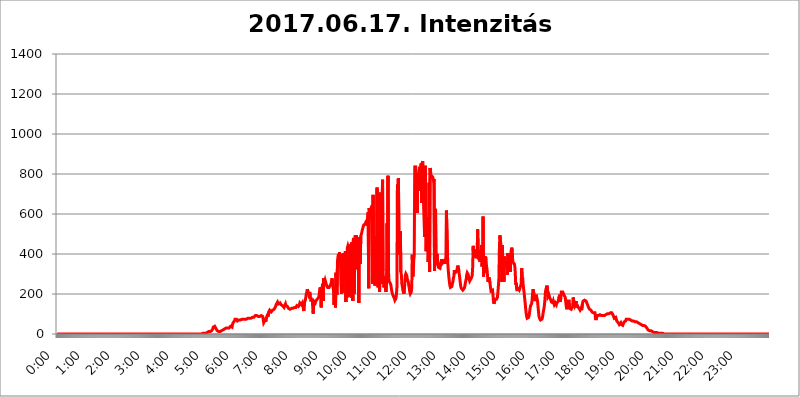
| Category | 2017.06.17. Intenzitás [W/m^2] |
|---|---|
| 0.0 | 0 |
| 0.0006944444444444445 | 0 |
| 0.001388888888888889 | 0 |
| 0.0020833333333333333 | 0 |
| 0.002777777777777778 | 0 |
| 0.003472222222222222 | 0 |
| 0.004166666666666667 | 0 |
| 0.004861111111111111 | 0 |
| 0.005555555555555556 | 0 |
| 0.0062499999999999995 | 0 |
| 0.006944444444444444 | 0 |
| 0.007638888888888889 | 0 |
| 0.008333333333333333 | 0 |
| 0.009027777777777779 | 0 |
| 0.009722222222222222 | 0 |
| 0.010416666666666666 | 0 |
| 0.011111111111111112 | 0 |
| 0.011805555555555555 | 0 |
| 0.012499999999999999 | 0 |
| 0.013194444444444444 | 0 |
| 0.013888888888888888 | 0 |
| 0.014583333333333332 | 0 |
| 0.015277777777777777 | 0 |
| 0.015972222222222224 | 0 |
| 0.016666666666666666 | 0 |
| 0.017361111111111112 | 0 |
| 0.018055555555555557 | 0 |
| 0.01875 | 0 |
| 0.019444444444444445 | 0 |
| 0.02013888888888889 | 0 |
| 0.020833333333333332 | 0 |
| 0.02152777777777778 | 0 |
| 0.022222222222222223 | 0 |
| 0.02291666666666667 | 0 |
| 0.02361111111111111 | 0 |
| 0.024305555555555556 | 0 |
| 0.024999999999999998 | 0 |
| 0.025694444444444447 | 0 |
| 0.02638888888888889 | 0 |
| 0.027083333333333334 | 0 |
| 0.027777777777777776 | 0 |
| 0.02847222222222222 | 0 |
| 0.029166666666666664 | 0 |
| 0.029861111111111113 | 0 |
| 0.030555555555555555 | 0 |
| 0.03125 | 0 |
| 0.03194444444444445 | 0 |
| 0.03263888888888889 | 0 |
| 0.03333333333333333 | 0 |
| 0.034027777777777775 | 0 |
| 0.034722222222222224 | 0 |
| 0.035416666666666666 | 0 |
| 0.036111111111111115 | 0 |
| 0.03680555555555556 | 0 |
| 0.0375 | 0 |
| 0.03819444444444444 | 0 |
| 0.03888888888888889 | 0 |
| 0.03958333333333333 | 0 |
| 0.04027777777777778 | 0 |
| 0.04097222222222222 | 0 |
| 0.041666666666666664 | 0 |
| 0.042361111111111106 | 0 |
| 0.04305555555555556 | 0 |
| 0.043750000000000004 | 0 |
| 0.044444444444444446 | 0 |
| 0.04513888888888889 | 0 |
| 0.04583333333333334 | 0 |
| 0.04652777777777778 | 0 |
| 0.04722222222222222 | 0 |
| 0.04791666666666666 | 0 |
| 0.04861111111111111 | 0 |
| 0.049305555555555554 | 0 |
| 0.049999999999999996 | 0 |
| 0.05069444444444445 | 0 |
| 0.051388888888888894 | 0 |
| 0.052083333333333336 | 0 |
| 0.05277777777777778 | 0 |
| 0.05347222222222222 | 0 |
| 0.05416666666666667 | 0 |
| 0.05486111111111111 | 0 |
| 0.05555555555555555 | 0 |
| 0.05625 | 0 |
| 0.05694444444444444 | 0 |
| 0.057638888888888885 | 0 |
| 0.05833333333333333 | 0 |
| 0.05902777777777778 | 0 |
| 0.059722222222222225 | 0 |
| 0.06041666666666667 | 0 |
| 0.061111111111111116 | 0 |
| 0.06180555555555556 | 0 |
| 0.0625 | 0 |
| 0.06319444444444444 | 0 |
| 0.06388888888888888 | 0 |
| 0.06458333333333334 | 0 |
| 0.06527777777777778 | 0 |
| 0.06597222222222222 | 0 |
| 0.06666666666666667 | 0 |
| 0.06736111111111111 | 0 |
| 0.06805555555555555 | 0 |
| 0.06874999999999999 | 0 |
| 0.06944444444444443 | 0 |
| 0.07013888888888889 | 0 |
| 0.07083333333333333 | 0 |
| 0.07152777777777779 | 0 |
| 0.07222222222222223 | 0 |
| 0.07291666666666667 | 0 |
| 0.07361111111111111 | 0 |
| 0.07430555555555556 | 0 |
| 0.075 | 0 |
| 0.07569444444444444 | 0 |
| 0.0763888888888889 | 0 |
| 0.07708333333333334 | 0 |
| 0.07777777777777778 | 0 |
| 0.07847222222222222 | 0 |
| 0.07916666666666666 | 0 |
| 0.0798611111111111 | 0 |
| 0.08055555555555556 | 0 |
| 0.08125 | 0 |
| 0.08194444444444444 | 0 |
| 0.08263888888888889 | 0 |
| 0.08333333333333333 | 0 |
| 0.08402777777777777 | 0 |
| 0.08472222222222221 | 0 |
| 0.08541666666666665 | 0 |
| 0.08611111111111112 | 0 |
| 0.08680555555555557 | 0 |
| 0.08750000000000001 | 0 |
| 0.08819444444444445 | 0 |
| 0.08888888888888889 | 0 |
| 0.08958333333333333 | 0 |
| 0.09027777777777778 | 0 |
| 0.09097222222222222 | 0 |
| 0.09166666666666667 | 0 |
| 0.09236111111111112 | 0 |
| 0.09305555555555556 | 0 |
| 0.09375 | 0 |
| 0.09444444444444444 | 0 |
| 0.09513888888888888 | 0 |
| 0.09583333333333333 | 0 |
| 0.09652777777777777 | 0 |
| 0.09722222222222222 | 0 |
| 0.09791666666666667 | 0 |
| 0.09861111111111111 | 0 |
| 0.09930555555555555 | 0 |
| 0.09999999999999999 | 0 |
| 0.10069444444444443 | 0 |
| 0.1013888888888889 | 0 |
| 0.10208333333333335 | 0 |
| 0.10277777777777779 | 0 |
| 0.10347222222222223 | 0 |
| 0.10416666666666667 | 0 |
| 0.10486111111111111 | 0 |
| 0.10555555555555556 | 0 |
| 0.10625 | 0 |
| 0.10694444444444444 | 0 |
| 0.1076388888888889 | 0 |
| 0.10833333333333334 | 0 |
| 0.10902777777777778 | 0 |
| 0.10972222222222222 | 0 |
| 0.1111111111111111 | 0 |
| 0.11180555555555556 | 0 |
| 0.11180555555555556 | 0 |
| 0.1125 | 0 |
| 0.11319444444444444 | 0 |
| 0.11388888888888889 | 0 |
| 0.11458333333333333 | 0 |
| 0.11527777777777777 | 0 |
| 0.11597222222222221 | 0 |
| 0.11666666666666665 | 0 |
| 0.1173611111111111 | 0 |
| 0.11805555555555557 | 0 |
| 0.11944444444444445 | 0 |
| 0.12013888888888889 | 0 |
| 0.12083333333333333 | 0 |
| 0.12152777777777778 | 0 |
| 0.12222222222222223 | 0 |
| 0.12291666666666667 | 0 |
| 0.12291666666666667 | 0 |
| 0.12361111111111112 | 0 |
| 0.12430555555555556 | 0 |
| 0.125 | 0 |
| 0.12569444444444444 | 0 |
| 0.12638888888888888 | 0 |
| 0.12708333333333333 | 0 |
| 0.16875 | 0 |
| 0.12847222222222224 | 0 |
| 0.12916666666666668 | 0 |
| 0.12986111111111112 | 0 |
| 0.13055555555555556 | 0 |
| 0.13125 | 0 |
| 0.13194444444444445 | 0 |
| 0.1326388888888889 | 0 |
| 0.13333333333333333 | 0 |
| 0.13402777777777777 | 0 |
| 0.13402777777777777 | 0 |
| 0.13472222222222222 | 0 |
| 0.13541666666666666 | 0 |
| 0.1361111111111111 | 0 |
| 0.13749999999999998 | 0 |
| 0.13819444444444443 | 0 |
| 0.1388888888888889 | 0 |
| 0.13958333333333334 | 0 |
| 0.14027777777777778 | 0 |
| 0.14097222222222222 | 0 |
| 0.14166666666666666 | 0 |
| 0.1423611111111111 | 0 |
| 0.14305555555555557 | 0 |
| 0.14375000000000002 | 0 |
| 0.14444444444444446 | 0 |
| 0.1451388888888889 | 0 |
| 0.1451388888888889 | 0 |
| 0.14652777777777778 | 0 |
| 0.14722222222222223 | 0 |
| 0.14791666666666667 | 0 |
| 0.1486111111111111 | 0 |
| 0.14930555555555555 | 0 |
| 0.15 | 0 |
| 0.15069444444444444 | 0 |
| 0.15138888888888888 | 0 |
| 0.15208333333333332 | 0 |
| 0.15277777777777776 | 0 |
| 0.15347222222222223 | 0 |
| 0.15416666666666667 | 0 |
| 0.15486111111111112 | 0 |
| 0.15555555555555556 | 0 |
| 0.15625 | 0 |
| 0.15694444444444444 | 0 |
| 0.15763888888888888 | 0 |
| 0.15833333333333333 | 0 |
| 0.15902777777777777 | 0 |
| 0.15972222222222224 | 0 |
| 0.16041666666666668 | 0 |
| 0.16111111111111112 | 0 |
| 0.16180555555555556 | 0 |
| 0.1625 | 0 |
| 0.16319444444444445 | 0 |
| 0.1638888888888889 | 0 |
| 0.16458333333333333 | 0 |
| 0.16527777777777777 | 0 |
| 0.16597222222222222 | 0 |
| 0.16666666666666666 | 0 |
| 0.1673611111111111 | 0 |
| 0.16805555555555554 | 0 |
| 0.16874999999999998 | 0 |
| 0.16944444444444443 | 0 |
| 0.17013888888888887 | 0 |
| 0.1708333333333333 | 0 |
| 0.17152777777777775 | 0 |
| 0.17222222222222225 | 0 |
| 0.1729166666666667 | 0 |
| 0.17361111111111113 | 0 |
| 0.17430555555555557 | 0 |
| 0.17500000000000002 | 0 |
| 0.17569444444444446 | 0 |
| 0.1763888888888889 | 0 |
| 0.17708333333333334 | 0 |
| 0.17777777777777778 | 0 |
| 0.17847222222222223 | 0 |
| 0.17916666666666667 | 0 |
| 0.1798611111111111 | 0 |
| 0.18055555555555555 | 0 |
| 0.18125 | 0 |
| 0.18194444444444444 | 0 |
| 0.1826388888888889 | 0 |
| 0.18333333333333335 | 0 |
| 0.1840277777777778 | 0 |
| 0.18472222222222223 | 0 |
| 0.18541666666666667 | 0 |
| 0.18611111111111112 | 0 |
| 0.18680555555555556 | 0 |
| 0.1875 | 0 |
| 0.18819444444444444 | 0 |
| 0.18888888888888888 | 0 |
| 0.18958333333333333 | 0 |
| 0.19027777777777777 | 0 |
| 0.1909722222222222 | 0 |
| 0.19166666666666665 | 0 |
| 0.19236111111111112 | 0 |
| 0.19305555555555554 | 0 |
| 0.19375 | 0 |
| 0.19444444444444445 | 0 |
| 0.1951388888888889 | 0 |
| 0.19583333333333333 | 0 |
| 0.19652777777777777 | 0 |
| 0.19722222222222222 | 0 |
| 0.19791666666666666 | 0 |
| 0.1986111111111111 | 0 |
| 0.19930555555555554 | 0 |
| 0.19999999999999998 | 0 |
| 0.20069444444444443 | 0 |
| 0.20138888888888887 | 0 |
| 0.2020833333333333 | 0 |
| 0.2027777777777778 | 0 |
| 0.2034722222222222 | 3.525 |
| 0.2041666666666667 | 3.525 |
| 0.20486111111111113 | 3.525 |
| 0.20555555555555557 | 3.525 |
| 0.20625000000000002 | 3.525 |
| 0.20694444444444446 | 3.525 |
| 0.2076388888888889 | 3.525 |
| 0.20833333333333334 | 3.525 |
| 0.20902777777777778 | 7.887 |
| 0.20972222222222223 | 7.887 |
| 0.21041666666666667 | 7.887 |
| 0.2111111111111111 | 7.887 |
| 0.21180555555555555 | 12.257 |
| 0.2125 | 12.257 |
| 0.21319444444444444 | 12.257 |
| 0.2138888888888889 | 12.257 |
| 0.21458333333333335 | 12.257 |
| 0.2152777777777778 | 12.257 |
| 0.21597222222222223 | 16.636 |
| 0.21666666666666667 | 16.636 |
| 0.21736111111111112 | 21.024 |
| 0.21805555555555556 | 25.419 |
| 0.21875 | 34.234 |
| 0.21944444444444444 | 34.234 |
| 0.22013888888888888 | 38.653 |
| 0.22083333333333333 | 38.653 |
| 0.22152777777777777 | 38.653 |
| 0.2222222222222222 | 34.234 |
| 0.22291666666666665 | 25.419 |
| 0.2236111111111111 | 21.024 |
| 0.22430555555555556 | 16.636 |
| 0.225 | 12.257 |
| 0.22569444444444445 | 12.257 |
| 0.2263888888888889 | 12.257 |
| 0.22708333333333333 | 12.257 |
| 0.22777777777777777 | 12.257 |
| 0.22847222222222222 | 12.257 |
| 0.22916666666666666 | 12.257 |
| 0.2298611111111111 | 16.636 |
| 0.23055555555555554 | 16.636 |
| 0.23124999999999998 | 21.024 |
| 0.23194444444444443 | 21.024 |
| 0.23263888888888887 | 21.024 |
| 0.2333333333333333 | 25.419 |
| 0.2340277777777778 | 25.419 |
| 0.2347222222222222 | 25.419 |
| 0.2354166666666667 | 25.419 |
| 0.23611111111111113 | 25.419 |
| 0.23680555555555557 | 29.823 |
| 0.23750000000000002 | 29.823 |
| 0.23819444444444446 | 29.823 |
| 0.2388888888888889 | 29.823 |
| 0.23958333333333334 | 29.823 |
| 0.24027777777777778 | 29.823 |
| 0.24097222222222223 | 29.823 |
| 0.24166666666666667 | 29.823 |
| 0.2423611111111111 | 29.823 |
| 0.24305555555555555 | 38.653 |
| 0.24375 | 34.234 |
| 0.24444444444444446 | 34.234 |
| 0.24513888888888888 | 34.234 |
| 0.24583333333333335 | 47.511 |
| 0.2465277777777778 | 56.398 |
| 0.24722222222222223 | 51.951 |
| 0.24791666666666667 | 60.85 |
| 0.24861111111111112 | 65.31 |
| 0.24930555555555556 | 74.246 |
| 0.25 | 74.246 |
| 0.25069444444444444 | 74.246 |
| 0.2513888888888889 | 74.246 |
| 0.2520833333333333 | 69.775 |
| 0.25277777777777777 | 65.31 |
| 0.2534722222222222 | 69.775 |
| 0.25416666666666665 | 69.775 |
| 0.2548611111111111 | 69.775 |
| 0.2555555555555556 | 69.775 |
| 0.25625000000000003 | 69.775 |
| 0.2569444444444445 | 69.775 |
| 0.2576388888888889 | 69.775 |
| 0.25833333333333336 | 74.246 |
| 0.2590277777777778 | 74.246 |
| 0.25972222222222224 | 74.246 |
| 0.2604166666666667 | 74.246 |
| 0.2611111111111111 | 74.246 |
| 0.26180555555555557 | 74.246 |
| 0.2625 | 74.246 |
| 0.26319444444444445 | 74.246 |
| 0.2638888888888889 | 74.246 |
| 0.26458333333333334 | 74.246 |
| 0.2652777777777778 | 74.246 |
| 0.2659722222222222 | 74.246 |
| 0.26666666666666666 | 78.722 |
| 0.2673611111111111 | 78.722 |
| 0.26805555555555555 | 78.722 |
| 0.26875 | 78.722 |
| 0.26944444444444443 | 78.722 |
| 0.2701388888888889 | 78.722 |
| 0.2708333333333333 | 78.722 |
| 0.27152777777777776 | 78.722 |
| 0.2722222222222222 | 83.205 |
| 0.27291666666666664 | 83.205 |
| 0.2736111111111111 | 83.205 |
| 0.2743055555555555 | 87.692 |
| 0.27499999999999997 | 83.205 |
| 0.27569444444444446 | 83.205 |
| 0.27638888888888885 | 87.692 |
| 0.27708333333333335 | 87.692 |
| 0.2777777777777778 | 92.184 |
| 0.27847222222222223 | 92.184 |
| 0.2791666666666667 | 92.184 |
| 0.2798611111111111 | 92.184 |
| 0.28055555555555556 | 92.184 |
| 0.28125 | 92.184 |
| 0.28194444444444444 | 87.692 |
| 0.2826388888888889 | 87.692 |
| 0.2833333333333333 | 87.692 |
| 0.28402777777777777 | 87.692 |
| 0.2847222222222222 | 92.184 |
| 0.28541666666666665 | 92.184 |
| 0.28611111111111115 | 92.184 |
| 0.28680555555555554 | 92.184 |
| 0.28750000000000003 | 92.184 |
| 0.2881944444444445 | 87.692 |
| 0.2888888888888889 | 83.205 |
| 0.28958333333333336 | 56.398 |
| 0.2902777777777778 | 56.398 |
| 0.29097222222222224 | 51.951 |
| 0.2916666666666667 | 69.775 |
| 0.2923611111111111 | 60.85 |
| 0.29305555555555557 | 74.246 |
| 0.29375 | 69.775 |
| 0.29444444444444445 | 69.775 |
| 0.2951388888888889 | 101.184 |
| 0.29583333333333334 | 87.692 |
| 0.2965277777777778 | 110.201 |
| 0.2972222222222222 | 114.716 |
| 0.29791666666666666 | 119.235 |
| 0.2986111111111111 | 119.235 |
| 0.29930555555555555 | 114.716 |
| 0.3 | 110.201 |
| 0.30069444444444443 | 110.201 |
| 0.3013888888888889 | 114.716 |
| 0.3020833333333333 | 119.235 |
| 0.30277777777777776 | 123.758 |
| 0.3034722222222222 | 123.758 |
| 0.30416666666666664 | 123.758 |
| 0.3048611111111111 | 128.284 |
| 0.3055555555555555 | 128.284 |
| 0.30624999999999997 | 137.347 |
| 0.3069444444444444 | 146.423 |
| 0.3076388888888889 | 150.964 |
| 0.30833333333333335 | 141.884 |
| 0.3090277777777778 | 160.056 |
| 0.30972222222222223 | 155.509 |
| 0.3104166666666667 | 150.964 |
| 0.3111111111111111 | 150.964 |
| 0.31180555555555556 | 150.964 |
| 0.3125 | 155.509 |
| 0.31319444444444444 | 150.964 |
| 0.3138888888888889 | 146.423 |
| 0.3145833333333333 | 146.423 |
| 0.31527777777777777 | 146.423 |
| 0.3159722222222222 | 141.884 |
| 0.31666666666666665 | 137.347 |
| 0.31736111111111115 | 137.347 |
| 0.31805555555555554 | 132.814 |
| 0.31875000000000003 | 137.347 |
| 0.3194444444444445 | 132.814 |
| 0.3201388888888889 | 150.964 |
| 0.32083333333333336 | 141.884 |
| 0.3215277777777778 | 146.423 |
| 0.32222222222222224 | 141.884 |
| 0.3229166666666667 | 137.347 |
| 0.3236111111111111 | 132.814 |
| 0.32430555555555557 | 128.284 |
| 0.325 | 128.284 |
| 0.32569444444444445 | 128.284 |
| 0.3263888888888889 | 123.758 |
| 0.32708333333333334 | 128.284 |
| 0.3277777777777778 | 123.758 |
| 0.3284722222222222 | 128.284 |
| 0.32916666666666666 | 123.758 |
| 0.3298611111111111 | 128.284 |
| 0.33055555555555555 | 128.284 |
| 0.33125 | 128.284 |
| 0.33194444444444443 | 128.284 |
| 0.3326388888888889 | 132.814 |
| 0.3333333333333333 | 132.814 |
| 0.3340277777777778 | 132.814 |
| 0.3347222222222222 | 132.814 |
| 0.3354166666666667 | 132.814 |
| 0.3361111111111111 | 141.884 |
| 0.3368055555555556 | 137.347 |
| 0.33749999999999997 | 137.347 |
| 0.33819444444444446 | 137.347 |
| 0.33888888888888885 | 137.347 |
| 0.33958333333333335 | 146.423 |
| 0.34027777777777773 | 155.509 |
| 0.34097222222222223 | 150.964 |
| 0.3416666666666666 | 150.964 |
| 0.3423611111111111 | 146.423 |
| 0.3430555555555555 | 150.964 |
| 0.34375 | 155.509 |
| 0.3444444444444445 | 155.509 |
| 0.3451388888888889 | 155.509 |
| 0.3458333333333334 | 114.716 |
| 0.34652777777777777 | 155.509 |
| 0.34722222222222227 | 160.056 |
| 0.34791666666666665 | 169.156 |
| 0.34861111111111115 | 182.82 |
| 0.34930555555555554 | 201.058 |
| 0.35000000000000003 | 210.182 |
| 0.3506944444444444 | 223.873 |
| 0.3513888888888889 | 228.436 |
| 0.3520833333333333 | 205.62 |
| 0.3527777777777778 | 196.497 |
| 0.3534722222222222 | 201.058 |
| 0.3541666666666667 | 210.182 |
| 0.3548611111111111 | 191.937 |
| 0.35555555555555557 | 169.156 |
| 0.35625 | 164.605 |
| 0.35694444444444445 | 173.709 |
| 0.3576388888888889 | 169.156 |
| 0.35833333333333334 | 164.605 |
| 0.3590277777777778 | 101.184 |
| 0.3597222222222222 | 164.605 |
| 0.36041666666666666 | 164.605 |
| 0.3611111111111111 | 164.605 |
| 0.36180555555555555 | 155.509 |
| 0.3625 | 164.605 |
| 0.36319444444444443 | 169.156 |
| 0.3638888888888889 | 169.156 |
| 0.3645833333333333 | 173.709 |
| 0.3652777777777778 | 173.709 |
| 0.3659722222222222 | 178.264 |
| 0.3666666666666667 | 182.82 |
| 0.3673611111111111 | 196.497 |
| 0.3680555555555556 | 219.309 |
| 0.36874999999999997 | 233 |
| 0.36944444444444446 | 219.309 |
| 0.37013888888888885 | 132.814 |
| 0.37083333333333335 | 219.309 |
| 0.37152777777777773 | 223.873 |
| 0.37222222222222223 | 251.251 |
| 0.3729166666666666 | 164.605 |
| 0.3736111111111111 | 278.603 |
| 0.3743055555555555 | 269.49 |
| 0.375 | 260.373 |
| 0.3756944444444445 | 269.49 |
| 0.3763888888888889 | 260.373 |
| 0.3770833333333334 | 251.251 |
| 0.37777777777777777 | 242.127 |
| 0.37847222222222227 | 237.564 |
| 0.37916666666666665 | 233 |
| 0.37986111111111115 | 228.436 |
| 0.38055555555555554 | 233 |
| 0.38125000000000003 | 233 |
| 0.3819444444444444 | 237.564 |
| 0.3826388888888889 | 242.127 |
| 0.3833333333333333 | 246.689 |
| 0.3840277777777778 | 251.251 |
| 0.3847222222222222 | 264.932 |
| 0.3854166666666667 | 278.603 |
| 0.3861111111111111 | 274.047 |
| 0.38680555555555557 | 274.047 |
| 0.3875 | 219.309 |
| 0.38819444444444445 | 146.423 |
| 0.3888888888888889 | 223.873 |
| 0.38958333333333334 | 182.82 |
| 0.3902777777777778 | 132.814 |
| 0.3909722222222222 | 305.898 |
| 0.39166666666666666 | 233 |
| 0.3923611111111111 | 196.497 |
| 0.39305555555555555 | 364.728 |
| 0.39375 | 387.202 |
| 0.39444444444444443 | 400.638 |
| 0.3951388888888889 | 351.198 |
| 0.3958333333333333 | 409.574 |
| 0.3965277777777778 | 369.23 |
| 0.3972222222222222 | 400.638 |
| 0.3979166666666667 | 396.164 |
| 0.3986111111111111 | 201.058 |
| 0.3993055555555556 | 233 |
| 0.39999999999999997 | 364.728 |
| 0.40069444444444446 | 205.62 |
| 0.40138888888888885 | 405.108 |
| 0.40208333333333335 | 400.638 |
| 0.40277777777777773 | 378.224 |
| 0.40347222222222223 | 400.638 |
| 0.4041666666666666 | 414.035 |
| 0.4048611111111111 | 160.056 |
| 0.4055555555555555 | 405.108 |
| 0.40625 | 182.82 |
| 0.4069444444444445 | 431.833 |
| 0.4076388888888889 | 440.702 |
| 0.4083333333333334 | 431.833 |
| 0.40902777777777777 | 431.833 |
| 0.40972222222222227 | 431.833 |
| 0.41041666666666665 | 187.378 |
| 0.41111111111111115 | 431.833 |
| 0.41180555555555554 | 449.551 |
| 0.41250000000000003 | 182.82 |
| 0.4131944444444444 | 458.38 |
| 0.4138888888888889 | 458.38 |
| 0.4145833333333333 | 164.605 |
| 0.4152777777777778 | 471.582 |
| 0.4159722222222222 | 480.356 |
| 0.4166666666666667 | 201.058 |
| 0.4173611111111111 | 462.786 |
| 0.41805555555555557 | 493.475 |
| 0.41875 | 324.052 |
| 0.41944444444444445 | 493.475 |
| 0.4201388888888889 | 475.972 |
| 0.42083333333333334 | 462.786 |
| 0.4215277777777778 | 467.187 |
| 0.4222222222222222 | 471.582 |
| 0.42291666666666666 | 155.509 |
| 0.4236111111111111 | 484.735 |
| 0.42430555555555555 | 480.356 |
| 0.425 | 351.198 |
| 0.42569444444444443 | 489.108 |
| 0.4263888888888889 | 493.475 |
| 0.4270833333333333 | 506.542 |
| 0.4277777777777778 | 519.555 |
| 0.4284722222222222 | 528.2 |
| 0.4291666666666667 | 532.513 |
| 0.4298611111111111 | 545.416 |
| 0.4305555555555556 | 549.704 |
| 0.43124999999999997 | 549.704 |
| 0.43194444444444446 | 549.704 |
| 0.43263888888888885 | 558.261 |
| 0.43333333333333335 | 553.986 |
| 0.43402777777777773 | 566.793 |
| 0.43472222222222223 | 541.121 |
| 0.4354166666666666 | 588.009 |
| 0.4361111111111111 | 609.062 |
| 0.4368055555555555 | 228.436 |
| 0.4375 | 629.948 |
| 0.4381944444444445 | 617.436 |
| 0.4388888888888889 | 617.436 |
| 0.4395833333333334 | 625.784 |
| 0.44027777777777777 | 613.252 |
| 0.44097222222222227 | 575.299 |
| 0.44166666666666665 | 642.4 |
| 0.44236111111111115 | 251.251 |
| 0.44305555555555554 | 695.666 |
| 0.44375000000000003 | 264.932 |
| 0.4444444444444444 | 278.603 |
| 0.4451388888888889 | 296.808 |
| 0.4458333333333333 | 242.127 |
| 0.4465277777777778 | 489.108 |
| 0.4472222222222222 | 324.052 |
| 0.4479166666666667 | 274.047 |
| 0.4486111111111111 | 731.896 |
| 0.44930555555555557 | 269.49 |
| 0.45 | 233 |
| 0.45069444444444445 | 333.113 |
| 0.4513888888888889 | 264.932 |
| 0.45208333333333334 | 210.182 |
| 0.4527777777777778 | 369.23 |
| 0.4534722222222222 | 707.8 |
| 0.45416666666666666 | 251.251 |
| 0.4548611111111111 | 251.251 |
| 0.45555555555555555 | 255.813 |
| 0.45625 | 771.559 |
| 0.45694444444444443 | 314.98 |
| 0.4576388888888889 | 260.373 |
| 0.4583333333333333 | 233 |
| 0.4590277777777778 | 287.709 |
| 0.4597222222222222 | 242.127 |
| 0.4604166666666667 | 223.873 |
| 0.4611111111111111 | 210.182 |
| 0.4618055555555556 | 264.932 |
| 0.46249999999999997 | 553.986 |
| 0.46319444444444446 | 337.639 |
| 0.46388888888888885 | 791.169 |
| 0.46458333333333335 | 310.44 |
| 0.46527777777777773 | 264.932 |
| 0.46597222222222223 | 269.49 |
| 0.4666666666666666 | 264.932 |
| 0.4673611111111111 | 251.251 |
| 0.4680555555555555 | 242.127 |
| 0.46875 | 223.873 |
| 0.4694444444444445 | 210.182 |
| 0.4701388888888889 | 201.058 |
| 0.4708333333333334 | 196.497 |
| 0.47152777777777777 | 187.378 |
| 0.47222222222222227 | 182.82 |
| 0.47291666666666665 | 178.264 |
| 0.47361111111111115 | 169.156 |
| 0.47430555555555554 | 164.605 |
| 0.47500000000000003 | 178.264 |
| 0.4756944444444444 | 196.497 |
| 0.4763888888888889 | 233 |
| 0.4770833333333333 | 747.834 |
| 0.4777777777777778 | 675.311 |
| 0.4784722222222222 | 779.42 |
| 0.4791666666666667 | 519.555 |
| 0.4798611111111111 | 396.164 |
| 0.48055555555555557 | 475.972 |
| 0.48125 | 515.223 |
| 0.48194444444444445 | 310.44 |
| 0.4826388888888889 | 296.808 |
| 0.48333333333333334 | 251.251 |
| 0.4840277777777778 | 237.564 |
| 0.4847222222222222 | 219.309 |
| 0.48541666666666666 | 210.182 |
| 0.4861111111111111 | 201.058 |
| 0.48680555555555555 | 214.746 |
| 0.4875 | 255.813 |
| 0.48819444444444443 | 292.259 |
| 0.4888888888888889 | 301.354 |
| 0.4895833333333333 | 296.808 |
| 0.4902777777777778 | 292.259 |
| 0.4909722222222222 | 274.047 |
| 0.4916666666666667 | 278.603 |
| 0.4923611111111111 | 260.373 |
| 0.4930555555555556 | 242.127 |
| 0.49374999999999997 | 228.436 |
| 0.49444444444444446 | 210.182 |
| 0.49513888888888885 | 201.058 |
| 0.49583333333333335 | 196.497 |
| 0.49652777777777773 | 210.182 |
| 0.49722222222222223 | 233 |
| 0.4979166666666666 | 396.164 |
| 0.4986111111111111 | 287.709 |
| 0.4993055555555555 | 296.808 |
| 0.5 | 369.23 |
| 0.5006944444444444 | 391.685 |
| 0.5013888888888889 | 833.834 |
| 0.5020833333333333 | 841.526 |
| 0.5027777777777778 | 822.26 |
| 0.5034722222222222 | 806.757 |
| 0.5041666666666667 | 798.974 |
| 0.5048611111111111 | 604.864 |
| 0.5055555555555555 | 802.868 |
| 0.50625 | 791.169 |
| 0.5069444444444444 | 715.858 |
| 0.5076388888888889 | 818.392 |
| 0.5083333333333333 | 814.519 |
| 0.5090277777777777 | 810.641 |
| 0.5097222222222222 | 806.757 |
| 0.5104166666666666 | 853.029 |
| 0.5111111111111112 | 654.791 |
| 0.5118055555555555 | 853.029 |
| 0.5125000000000001 | 864.493 |
| 0.5131944444444444 | 791.169 |
| 0.513888888888889 | 629.948 |
| 0.5145833333333333 | 634.105 |
| 0.5152777777777778 | 484.735 |
| 0.5159722222222222 | 841.526 |
| 0.5166666666666667 | 617.436 |
| 0.517361111111111 | 414.035 |
| 0.5180555555555556 | 583.779 |
| 0.5187499999999999 | 571.049 |
| 0.5194444444444445 | 453.968 |
| 0.5201388888888888 | 360.221 |
| 0.5208333333333334 | 414.035 |
| 0.5215277777777778 | 755.766 |
| 0.5222222222222223 | 310.44 |
| 0.5229166666666667 | 829.981 |
| 0.5236111111111111 | 814.519 |
| 0.5243055555555556 | 779.42 |
| 0.525 | 795.074 |
| 0.5256944444444445 | 775.492 |
| 0.5263888888888889 | 787.258 |
| 0.5270833333333333 | 775.492 |
| 0.5277777777777778 | 767.62 |
| 0.5284722222222222 | 775.492 |
| 0.5291666666666667 | 314.98 |
| 0.5298611111111111 | 510.885 |
| 0.5305555555555556 | 625.784 |
| 0.53125 | 346.682 |
| 0.5319444444444444 | 342.162 |
| 0.5326388888888889 | 400.638 |
| 0.5333333333333333 | 364.728 |
| 0.5340277777777778 | 342.162 |
| 0.5347222222222222 | 333.113 |
| 0.5354166666666667 | 333.113 |
| 0.5361111111111111 | 328.584 |
| 0.5368055555555555 | 328.584 |
| 0.5375 | 333.113 |
| 0.5381944444444444 | 333.113 |
| 0.5388888888888889 | 373.729 |
| 0.5395833333333333 | 351.198 |
| 0.5402777777777777 | 346.682 |
| 0.5409722222222222 | 355.712 |
| 0.5416666666666666 | 360.221 |
| 0.5423611111111112 | 373.729 |
| 0.5430555555555555 | 369.23 |
| 0.5437500000000001 | 351.198 |
| 0.5444444444444444 | 369.23 |
| 0.545138888888889 | 387.202 |
| 0.5458333333333333 | 617.436 |
| 0.5465277777777778 | 613.252 |
| 0.5472222222222222 | 409.574 |
| 0.5479166666666667 | 342.162 |
| 0.548611111111111 | 310.44 |
| 0.5493055555555556 | 283.156 |
| 0.5499999999999999 | 260.373 |
| 0.5506944444444445 | 242.127 |
| 0.5513888888888888 | 233 |
| 0.5520833333333334 | 228.436 |
| 0.5527777777777778 | 228.436 |
| 0.5534722222222223 | 237.564 |
| 0.5541666666666667 | 251.251 |
| 0.5548611111111111 | 260.373 |
| 0.5555555555555556 | 278.603 |
| 0.55625 | 287.709 |
| 0.5569444444444445 | 319.517 |
| 0.5576388888888889 | 305.898 |
| 0.5583333333333333 | 301.354 |
| 0.5590277777777778 | 301.354 |
| 0.5597222222222222 | 310.44 |
| 0.5604166666666667 | 314.98 |
| 0.5611111111111111 | 328.584 |
| 0.5618055555555556 | 342.162 |
| 0.5625 | 337.639 |
| 0.5631944444444444 | 319.517 |
| 0.5638888888888889 | 296.808 |
| 0.5645833333333333 | 278.603 |
| 0.5652777777777778 | 255.813 |
| 0.5659722222222222 | 237.564 |
| 0.5666666666666667 | 228.436 |
| 0.5673611111111111 | 228.436 |
| 0.5680555555555555 | 223.873 |
| 0.56875 | 219.309 |
| 0.5694444444444444 | 219.309 |
| 0.5701388888888889 | 219.309 |
| 0.5708333333333333 | 228.436 |
| 0.5715277777777777 | 237.564 |
| 0.5722222222222222 | 251.251 |
| 0.5729166666666666 | 264.932 |
| 0.5736111111111112 | 274.047 |
| 0.5743055555555555 | 296.808 |
| 0.5750000000000001 | 305.898 |
| 0.5756944444444444 | 310.44 |
| 0.576388888888889 | 296.808 |
| 0.5770833333333333 | 283.156 |
| 0.5777777777777778 | 274.047 |
| 0.5784722222222222 | 264.932 |
| 0.5791666666666667 | 264.932 |
| 0.579861111111111 | 269.49 |
| 0.5805555555555556 | 278.603 |
| 0.5812499999999999 | 283.156 |
| 0.5819444444444445 | 292.259 |
| 0.5826388888888888 | 333.113 |
| 0.5833333333333334 | 440.702 |
| 0.5840277777777778 | 387.202 |
| 0.5847222222222223 | 387.202 |
| 0.5854166666666667 | 396.164 |
| 0.5861111111111111 | 422.943 |
| 0.5868055555555556 | 414.035 |
| 0.5875 | 396.164 |
| 0.5881944444444445 | 378.224 |
| 0.5888888888888889 | 387.202 |
| 0.5895833333333333 | 523.88 |
| 0.5902777777777778 | 436.27 |
| 0.5909722222222222 | 431.833 |
| 0.5916666666666667 | 369.23 |
| 0.5923611111111111 | 378.224 |
| 0.5930555555555556 | 360.221 |
| 0.59375 | 355.712 |
| 0.5944444444444444 | 414.035 |
| 0.5951388888888889 | 445.129 |
| 0.5958333333333333 | 337.639 |
| 0.5965277777777778 | 360.221 |
| 0.5972222222222222 | 588.009 |
| 0.5979166666666667 | 287.709 |
| 0.5986111111111111 | 355.712 |
| 0.5993055555555555 | 305.898 |
| 0.6 | 310.44 |
| 0.6006944444444444 | 387.202 |
| 0.6013888888888889 | 369.23 |
| 0.6020833333333333 | 337.639 |
| 0.6027777777777777 | 324.052 |
| 0.6034722222222222 | 292.259 |
| 0.6041666666666666 | 260.373 |
| 0.6048611111111112 | 264.932 |
| 0.6055555555555555 | 283.156 |
| 0.6062500000000001 | 287.709 |
| 0.6069444444444444 | 255.813 |
| 0.607638888888889 | 233 |
| 0.6083333333333333 | 214.746 |
| 0.6090277777777778 | 214.746 |
| 0.6097222222222222 | 214.746 |
| 0.6104166666666667 | 219.309 |
| 0.611111111111111 | 196.497 |
| 0.6118055555555556 | 164.605 |
| 0.6124999999999999 | 150.964 |
| 0.6131944444444445 | 160.056 |
| 0.6138888888888888 | 173.709 |
| 0.6145833333333334 | 173.709 |
| 0.6152777777777778 | 173.709 |
| 0.6159722222222223 | 173.709 |
| 0.6166666666666667 | 173.709 |
| 0.6173611111111111 | 182.82 |
| 0.6180555555555556 | 210.182 |
| 0.61875 | 242.127 |
| 0.6194444444444445 | 278.603 |
| 0.6201388888888889 | 431.833 |
| 0.6208333333333333 | 493.475 |
| 0.6215277777777778 | 471.582 |
| 0.6222222222222222 | 449.551 |
| 0.6229166666666667 | 351.198 |
| 0.6236111111111111 | 260.373 |
| 0.6243055555555556 | 445.129 |
| 0.625 | 292.259 |
| 0.6256944444444444 | 342.162 |
| 0.6263888888888889 | 260.373 |
| 0.6270833333333333 | 387.202 |
| 0.6277777777777778 | 364.728 |
| 0.6284722222222222 | 355.712 |
| 0.6291666666666667 | 351.198 |
| 0.6298611111111111 | 346.682 |
| 0.6305555555555555 | 364.728 |
| 0.63125 | 296.808 |
| 0.6319444444444444 | 405.108 |
| 0.6326388888888889 | 382.715 |
| 0.6333333333333333 | 396.164 |
| 0.6340277777777777 | 396.164 |
| 0.6347222222222222 | 337.639 |
| 0.6354166666666666 | 310.44 |
| 0.6361111111111112 | 314.98 |
| 0.6368055555555555 | 418.492 |
| 0.6375000000000001 | 431.833 |
| 0.6381944444444444 | 414.035 |
| 0.638888888888889 | 360.221 |
| 0.6395833333333333 | 360.221 |
| 0.6402777777777778 | 355.712 |
| 0.6409722222222222 | 351.198 |
| 0.6416666666666667 | 342.162 |
| 0.642361111111111 | 305.898 |
| 0.6430555555555556 | 246.689 |
| 0.6437499999999999 | 255.813 |
| 0.6444444444444445 | 223.873 |
| 0.6451388888888888 | 214.746 |
| 0.6458333333333334 | 228.436 |
| 0.6465277777777778 | 223.873 |
| 0.6472222222222223 | 223.873 |
| 0.6479166666666667 | 219.309 |
| 0.6486111111111111 | 219.309 |
| 0.6493055555555556 | 233 |
| 0.65 | 242.127 |
| 0.6506944444444445 | 251.251 |
| 0.6513888888888889 | 328.584 |
| 0.6520833333333333 | 287.709 |
| 0.6527777777777778 | 278.603 |
| 0.6534722222222222 | 246.689 |
| 0.6541666666666667 | 223.873 |
| 0.6548611111111111 | 205.62 |
| 0.6555555555555556 | 178.264 |
| 0.65625 | 155.509 |
| 0.6569444444444444 | 128.284 |
| 0.6576388888888889 | 105.69 |
| 0.6583333333333333 | 87.692 |
| 0.6590277777777778 | 78.722 |
| 0.6597222222222222 | 74.246 |
| 0.6604166666666667 | 74.246 |
| 0.6611111111111111 | 83.205 |
| 0.6618055555555555 | 92.184 |
| 0.6625 | 110.201 |
| 0.6631944444444444 | 128.284 |
| 0.6638888888888889 | 141.884 |
| 0.6645833333333333 | 146.423 |
| 0.6652777777777777 | 150.964 |
| 0.6659722222222222 | 169.156 |
| 0.6666666666666666 | 201.058 |
| 0.6673611111111111 | 223.873 |
| 0.6680555555555556 | 219.309 |
| 0.6687500000000001 | 196.497 |
| 0.6694444444444444 | 173.709 |
| 0.6701388888888888 | 164.605 |
| 0.6708333333333334 | 178.264 |
| 0.6715277777777778 | 196.497 |
| 0.6722222222222222 | 187.378 |
| 0.6729166666666666 | 178.264 |
| 0.6736111111111112 | 164.605 |
| 0.6743055555555556 | 137.347 |
| 0.6749999999999999 | 110.201 |
| 0.6756944444444444 | 87.692 |
| 0.6763888888888889 | 78.722 |
| 0.6770833333333334 | 74.246 |
| 0.6777777777777777 | 69.775 |
| 0.6784722222222223 | 69.775 |
| 0.6791666666666667 | 69.775 |
| 0.6798611111111111 | 74.246 |
| 0.6805555555555555 | 83.205 |
| 0.68125 | 101.184 |
| 0.6819444444444445 | 114.716 |
| 0.6826388888888889 | 128.284 |
| 0.6833333333333332 | 146.423 |
| 0.6840277777777778 | 173.709 |
| 0.6847222222222222 | 210.182 |
| 0.6854166666666667 | 223.873 |
| 0.686111111111111 | 233 |
| 0.6868055555555556 | 242.127 |
| 0.6875 | 228.436 |
| 0.6881944444444444 | 187.378 |
| 0.688888888888889 | 182.82 |
| 0.6895833333333333 | 196.497 |
| 0.6902777777777778 | 191.937 |
| 0.6909722222222222 | 178.264 |
| 0.6916666666666668 | 182.82 |
| 0.6923611111111111 | 169.156 |
| 0.6930555555555555 | 160.056 |
| 0.69375 | 155.509 |
| 0.6944444444444445 | 155.509 |
| 0.6951388888888889 | 155.509 |
| 0.6958333333333333 | 164.605 |
| 0.6965277777777777 | 155.509 |
| 0.6972222222222223 | 146.423 |
| 0.6979166666666666 | 146.423 |
| 0.6986111111111111 | 155.509 |
| 0.6993055555555556 | 150.964 |
| 0.7000000000000001 | 146.423 |
| 0.7006944444444444 | 155.509 |
| 0.7013888888888888 | 150.964 |
| 0.7020833333333334 | 150.964 |
| 0.7027777777777778 | 164.605 |
| 0.7034722222222222 | 182.82 |
| 0.7041666666666666 | 187.378 |
| 0.7048611111111112 | 196.497 |
| 0.7055555555555556 | 160.056 |
| 0.7062499999999999 | 182.82 |
| 0.7069444444444444 | 210.182 |
| 0.7076388888888889 | 205.62 |
| 0.7083333333333334 | 210.182 |
| 0.7090277777777777 | 210.182 |
| 0.7097222222222223 | 210.182 |
| 0.7104166666666667 | 205.62 |
| 0.7111111111111111 | 191.937 |
| 0.7118055555555555 | 191.937 |
| 0.7125 | 182.82 |
| 0.7131944444444445 | 178.264 |
| 0.7138888888888889 | 137.347 |
| 0.7145833333333332 | 123.758 |
| 0.7152777777777778 | 123.758 |
| 0.7159722222222222 | 164.605 |
| 0.7166666666666667 | 164.605 |
| 0.717361111111111 | 164.605 |
| 0.7180555555555556 | 164.605 |
| 0.71875 | 128.284 |
| 0.7194444444444444 | 123.758 |
| 0.720138888888889 | 123.758 |
| 0.7208333333333333 | 123.758 |
| 0.7215277777777778 | 123.758 |
| 0.7222222222222222 | 128.284 |
| 0.7229166666666668 | 137.347 |
| 0.7236111111111111 | 182.82 |
| 0.7243055555555555 | 187.378 |
| 0.725 | 150.964 |
| 0.7256944444444445 | 141.884 |
| 0.7263888888888889 | 141.884 |
| 0.7270833333333333 | 146.423 |
| 0.7277777777777777 | 164.605 |
| 0.7284722222222223 | 132.814 |
| 0.7291666666666666 | 146.423 |
| 0.7298611111111111 | 137.347 |
| 0.7305555555555556 | 132.814 |
| 0.7312500000000001 | 132.814 |
| 0.7319444444444444 | 128.284 |
| 0.7326388888888888 | 132.814 |
| 0.7333333333333334 | 119.235 |
| 0.7340277777777778 | 123.758 |
| 0.7347222222222222 | 128.284 |
| 0.7354166666666666 | 119.235 |
| 0.7361111111111112 | 123.758 |
| 0.7368055555555556 | 155.509 |
| 0.7374999999999999 | 164.605 |
| 0.7381944444444444 | 164.605 |
| 0.7388888888888889 | 169.156 |
| 0.7395833333333334 | 169.156 |
| 0.7402777777777777 | 169.156 |
| 0.7409722222222223 | 164.605 |
| 0.7416666666666667 | 164.605 |
| 0.7423611111111111 | 164.605 |
| 0.7430555555555555 | 160.056 |
| 0.74375 | 146.423 |
| 0.7444444444444445 | 141.884 |
| 0.7451388888888889 | 132.814 |
| 0.7458333333333332 | 128.284 |
| 0.7465277777777778 | 123.758 |
| 0.7472222222222222 | 119.235 |
| 0.7479166666666667 | 119.235 |
| 0.748611111111111 | 119.235 |
| 0.7493055555555556 | 119.235 |
| 0.75 | 110.201 |
| 0.7506944444444444 | 105.69 |
| 0.751388888888889 | 105.69 |
| 0.7520833333333333 | 105.69 |
| 0.7527777777777778 | 105.69 |
| 0.7534722222222222 | 110.201 |
| 0.7541666666666668 | 105.69 |
| 0.7548611111111111 | 78.722 |
| 0.7555555555555555 | 69.775 |
| 0.75625 | 65.31 |
| 0.7569444444444445 | 92.184 |
| 0.7576388888888889 | 92.184 |
| 0.7583333333333333 | 92.184 |
| 0.7590277777777777 | 92.184 |
| 0.7597222222222223 | 92.184 |
| 0.7604166666666666 | 96.682 |
| 0.7611111111111111 | 96.682 |
| 0.7618055555555556 | 101.184 |
| 0.7625000000000001 | 92.184 |
| 0.7631944444444444 | 92.184 |
| 0.7638888888888888 | 92.184 |
| 0.7645833333333334 | 92.184 |
| 0.7652777777777778 | 92.184 |
| 0.7659722222222222 | 92.184 |
| 0.7666666666666666 | 92.184 |
| 0.7673611111111112 | 92.184 |
| 0.7680555555555556 | 96.682 |
| 0.7687499999999999 | 96.682 |
| 0.7694444444444444 | 96.682 |
| 0.7701388888888889 | 101.184 |
| 0.7708333333333334 | 101.184 |
| 0.7715277777777777 | 101.184 |
| 0.7722222222222223 | 101.184 |
| 0.7729166666666667 | 101.184 |
| 0.7736111111111111 | 101.184 |
| 0.7743055555555555 | 105.69 |
| 0.775 | 105.69 |
| 0.7756944444444445 | 105.69 |
| 0.7763888888888889 | 110.201 |
| 0.7770833333333332 | 110.201 |
| 0.7777777777777778 | 105.69 |
| 0.7784722222222222 | 101.184 |
| 0.7791666666666667 | 101.184 |
| 0.779861111111111 | 92.184 |
| 0.7805555555555556 | 92.184 |
| 0.78125 | 78.722 |
| 0.7819444444444444 | 83.205 |
| 0.782638888888889 | 83.205 |
| 0.7833333333333333 | 83.205 |
| 0.7840277777777778 | 78.722 |
| 0.7847222222222222 | 65.31 |
| 0.7854166666666668 | 65.31 |
| 0.7861111111111111 | 65.31 |
| 0.7868055555555555 | 56.398 |
| 0.7875 | 56.398 |
| 0.7881944444444445 | 47.511 |
| 0.7888888888888889 | 51.951 |
| 0.7895833333333333 | 51.951 |
| 0.7902777777777777 | 56.398 |
| 0.7909722222222223 | 47.511 |
| 0.7916666666666666 | 43.079 |
| 0.7923611111111111 | 43.079 |
| 0.7930555555555556 | 43.079 |
| 0.7937500000000001 | 43.079 |
| 0.7944444444444444 | 43.079 |
| 0.7951388888888888 | 60.85 |
| 0.7958333333333334 | 65.31 |
| 0.7965277777777778 | 65.31 |
| 0.7972222222222222 | 65.31 |
| 0.7979166666666666 | 74.246 |
| 0.7986111111111112 | 74.246 |
| 0.7993055555555556 | 74.246 |
| 0.7999999999999999 | 74.246 |
| 0.8006944444444444 | 74.246 |
| 0.8013888888888889 | 74.246 |
| 0.8020833333333334 | 74.246 |
| 0.8027777777777777 | 69.775 |
| 0.8034722222222223 | 69.775 |
| 0.8041666666666667 | 69.775 |
| 0.8048611111111111 | 69.775 |
| 0.8055555555555555 | 69.775 |
| 0.80625 | 65.31 |
| 0.8069444444444445 | 65.31 |
| 0.8076388888888889 | 65.31 |
| 0.8083333333333332 | 65.31 |
| 0.8090277777777778 | 60.85 |
| 0.8097222222222222 | 60.85 |
| 0.8104166666666667 | 60.85 |
| 0.811111111111111 | 60.85 |
| 0.8118055555555556 | 60.85 |
| 0.8125 | 60.85 |
| 0.8131944444444444 | 60.85 |
| 0.813888888888889 | 56.398 |
| 0.8145833333333333 | 56.398 |
| 0.8152777777777778 | 56.398 |
| 0.8159722222222222 | 56.398 |
| 0.8166666666666668 | 51.951 |
| 0.8173611111111111 | 47.511 |
| 0.8180555555555555 | 47.511 |
| 0.81875 | 47.511 |
| 0.8194444444444445 | 43.079 |
| 0.8201388888888889 | 43.079 |
| 0.8208333333333333 | 43.079 |
| 0.8215277777777777 | 47.511 |
| 0.8222222222222223 | 43.079 |
| 0.8229166666666666 | 43.079 |
| 0.8236111111111111 | 38.653 |
| 0.8243055555555556 | 38.653 |
| 0.8250000000000001 | 38.653 |
| 0.8256944444444444 | 38.653 |
| 0.8263888888888888 | 34.234 |
| 0.8270833333333334 | 29.823 |
| 0.8277777777777778 | 25.419 |
| 0.8284722222222222 | 21.024 |
| 0.8291666666666666 | 21.024 |
| 0.8298611111111112 | 21.024 |
| 0.8305555555555556 | 16.636 |
| 0.8312499999999999 | 16.636 |
| 0.8319444444444444 | 16.636 |
| 0.8326388888888889 | 16.636 |
| 0.8333333333333334 | 12.257 |
| 0.8340277777777777 | 12.257 |
| 0.8347222222222223 | 12.257 |
| 0.8354166666666667 | 12.257 |
| 0.8361111111111111 | 12.257 |
| 0.8368055555555555 | 7.887 |
| 0.8375 | 7.887 |
| 0.8381944444444445 | 7.887 |
| 0.8388888888888889 | 7.887 |
| 0.8395833333333332 | 7.887 |
| 0.8402777777777778 | 7.887 |
| 0.8409722222222222 | 7.887 |
| 0.8416666666666667 | 7.887 |
| 0.842361111111111 | 7.887 |
| 0.8430555555555556 | 3.525 |
| 0.84375 | 3.525 |
| 0.8444444444444444 | 3.525 |
| 0.845138888888889 | 3.525 |
| 0.8458333333333333 | 3.525 |
| 0.8465277777777778 | 3.525 |
| 0.8472222222222222 | 3.525 |
| 0.8479166666666668 | 3.525 |
| 0.8486111111111111 | 3.525 |
| 0.8493055555555555 | 3.525 |
| 0.85 | 0 |
| 0.8506944444444445 | 0 |
| 0.8513888888888889 | 0 |
| 0.8520833333333333 | 0 |
| 0.8527777777777777 | 0 |
| 0.8534722222222223 | 0 |
| 0.8541666666666666 | 0 |
| 0.8548611111111111 | 0 |
| 0.8555555555555556 | 0 |
| 0.8562500000000001 | 0 |
| 0.8569444444444444 | 0 |
| 0.8576388888888888 | 0 |
| 0.8583333333333334 | 0 |
| 0.8590277777777778 | 0 |
| 0.8597222222222222 | 0 |
| 0.8604166666666666 | 0 |
| 0.8611111111111112 | 0 |
| 0.8618055555555556 | 0 |
| 0.8624999999999999 | 0 |
| 0.8631944444444444 | 0 |
| 0.8638888888888889 | 0 |
| 0.8645833333333334 | 0 |
| 0.8652777777777777 | 0 |
| 0.8659722222222223 | 0 |
| 0.8666666666666667 | 0 |
| 0.8673611111111111 | 0 |
| 0.8680555555555555 | 0 |
| 0.86875 | 0 |
| 0.8694444444444445 | 0 |
| 0.8701388888888889 | 0 |
| 0.8708333333333332 | 0 |
| 0.8715277777777778 | 0 |
| 0.8722222222222222 | 0 |
| 0.8729166666666667 | 0 |
| 0.873611111111111 | 0 |
| 0.8743055555555556 | 0 |
| 0.875 | 0 |
| 0.8756944444444444 | 0 |
| 0.876388888888889 | 0 |
| 0.8770833333333333 | 0 |
| 0.8777777777777778 | 0 |
| 0.8784722222222222 | 0 |
| 0.8791666666666668 | 0 |
| 0.8798611111111111 | 0 |
| 0.8805555555555555 | 0 |
| 0.88125 | 0 |
| 0.8819444444444445 | 0 |
| 0.8826388888888889 | 0 |
| 0.8833333333333333 | 0 |
| 0.8840277777777777 | 0 |
| 0.8847222222222223 | 0 |
| 0.8854166666666666 | 0 |
| 0.8861111111111111 | 0 |
| 0.8868055555555556 | 0 |
| 0.8875000000000001 | 0 |
| 0.8881944444444444 | 0 |
| 0.8888888888888888 | 0 |
| 0.8895833333333334 | 0 |
| 0.8902777777777778 | 0 |
| 0.8909722222222222 | 0 |
| 0.8916666666666666 | 0 |
| 0.8923611111111112 | 0 |
| 0.8930555555555556 | 0 |
| 0.8937499999999999 | 0 |
| 0.8944444444444444 | 0 |
| 0.8951388888888889 | 0 |
| 0.8958333333333334 | 0 |
| 0.8965277777777777 | 0 |
| 0.8972222222222223 | 0 |
| 0.8979166666666667 | 0 |
| 0.8986111111111111 | 0 |
| 0.8993055555555555 | 0 |
| 0.9 | 0 |
| 0.9006944444444445 | 0 |
| 0.9013888888888889 | 0 |
| 0.9020833333333332 | 0 |
| 0.9027777777777778 | 0 |
| 0.9034722222222222 | 0 |
| 0.9041666666666667 | 0 |
| 0.904861111111111 | 0 |
| 0.9055555555555556 | 0 |
| 0.90625 | 0 |
| 0.9069444444444444 | 0 |
| 0.907638888888889 | 0 |
| 0.9083333333333333 | 0 |
| 0.9090277777777778 | 0 |
| 0.9097222222222222 | 0 |
| 0.9104166666666668 | 0 |
| 0.9111111111111111 | 0 |
| 0.9118055555555555 | 0 |
| 0.9125 | 0 |
| 0.9131944444444445 | 0 |
| 0.9138888888888889 | 0 |
| 0.9145833333333333 | 0 |
| 0.9152777777777777 | 0 |
| 0.9159722222222223 | 0 |
| 0.9166666666666666 | 0 |
| 0.9173611111111111 | 0 |
| 0.9180555555555556 | 0 |
| 0.9187500000000001 | 0 |
| 0.9194444444444444 | 0 |
| 0.9201388888888888 | 0 |
| 0.9208333333333334 | 0 |
| 0.9215277777777778 | 0 |
| 0.9222222222222222 | 0 |
| 0.9229166666666666 | 0 |
| 0.9236111111111112 | 0 |
| 0.9243055555555556 | 0 |
| 0.9249999999999999 | 0 |
| 0.9256944444444444 | 0 |
| 0.9263888888888889 | 0 |
| 0.9270833333333334 | 0 |
| 0.9277777777777777 | 0 |
| 0.9284722222222223 | 0 |
| 0.9291666666666667 | 0 |
| 0.9298611111111111 | 0 |
| 0.9305555555555555 | 0 |
| 0.93125 | 0 |
| 0.9319444444444445 | 0 |
| 0.9326388888888889 | 0 |
| 0.9333333333333332 | 0 |
| 0.9340277777777778 | 0 |
| 0.9347222222222222 | 0 |
| 0.9354166666666667 | 0 |
| 0.936111111111111 | 0 |
| 0.9368055555555556 | 0 |
| 0.9375 | 0 |
| 0.9381944444444444 | 0 |
| 0.938888888888889 | 0 |
| 0.9395833333333333 | 0 |
| 0.9402777777777778 | 0 |
| 0.9409722222222222 | 0 |
| 0.9416666666666668 | 0 |
| 0.9423611111111111 | 0 |
| 0.9430555555555555 | 0 |
| 0.94375 | 0 |
| 0.9444444444444445 | 0 |
| 0.9451388888888889 | 0 |
| 0.9458333333333333 | 0 |
| 0.9465277777777777 | 0 |
| 0.9472222222222223 | 0 |
| 0.9479166666666666 | 0 |
| 0.9486111111111111 | 0 |
| 0.9493055555555556 | 0 |
| 0.9500000000000001 | 0 |
| 0.9506944444444444 | 0 |
| 0.9513888888888888 | 0 |
| 0.9520833333333334 | 0 |
| 0.9527777777777778 | 0 |
| 0.9534722222222222 | 0 |
| 0.9541666666666666 | 0 |
| 0.9548611111111112 | 0 |
| 0.9555555555555556 | 0 |
| 0.9562499999999999 | 0 |
| 0.9569444444444444 | 0 |
| 0.9576388888888889 | 0 |
| 0.9583333333333334 | 0 |
| 0.9590277777777777 | 0 |
| 0.9597222222222223 | 0 |
| 0.9604166666666667 | 0 |
| 0.9611111111111111 | 0 |
| 0.9618055555555555 | 0 |
| 0.9625 | 0 |
| 0.9631944444444445 | 0 |
| 0.9638888888888889 | 0 |
| 0.9645833333333332 | 0 |
| 0.9652777777777778 | 0 |
| 0.9659722222222222 | 0 |
| 0.9666666666666667 | 0 |
| 0.967361111111111 | 0 |
| 0.9680555555555556 | 0 |
| 0.96875 | 0 |
| 0.9694444444444444 | 0 |
| 0.970138888888889 | 0 |
| 0.9708333333333333 | 0 |
| 0.9715277777777778 | 0 |
| 0.9722222222222222 | 0 |
| 0.9729166666666668 | 0 |
| 0.9736111111111111 | 0 |
| 0.9743055555555555 | 0 |
| 0.975 | 0 |
| 0.9756944444444445 | 0 |
| 0.9763888888888889 | 0 |
| 0.9770833333333333 | 0 |
| 0.9777777777777777 | 0 |
| 0.9784722222222223 | 0 |
| 0.9791666666666666 | 0 |
| 0.9798611111111111 | 0 |
| 0.9805555555555556 | 0 |
| 0.9812500000000001 | 0 |
| 0.9819444444444444 | 0 |
| 0.9826388888888888 | 0 |
| 0.9833333333333334 | 0 |
| 0.9840277777777778 | 0 |
| 0.9847222222222222 | 0 |
| 0.9854166666666666 | 0 |
| 0.9861111111111112 | 0 |
| 0.9868055555555556 | 0 |
| 0.9874999999999999 | 0 |
| 0.9881944444444444 | 0 |
| 0.9888888888888889 | 0 |
| 0.9895833333333334 | 0 |
| 0.9902777777777777 | 0 |
| 0.9909722222222223 | 0 |
| 0.9916666666666667 | 0 |
| 0.9923611111111111 | 0 |
| 0.9930555555555555 | 0 |
| 0.99375 | 0 |
| 0.9944444444444445 | 0 |
| 0.9951388888888889 | 0 |
| 0.9958333333333332 | 0 |
| 0.9965277777777778 | 0 |
| 0.9972222222222222 | 0 |
| 0.9979166666666667 | 0 |
| 0.998611111111111 | 0 |
| 0.9993055555555556 | 0 |